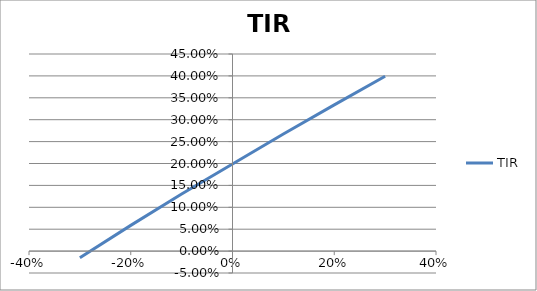
| Category | TIR |
|---|---|
| 0.3 | 0.399 |
| 0.2 | 0.334 |
| 0.1 | 0.268 |
| -0.1 | 0.13 |
| -0.2 | 0.059 |
| -0.3 | -0.015 |